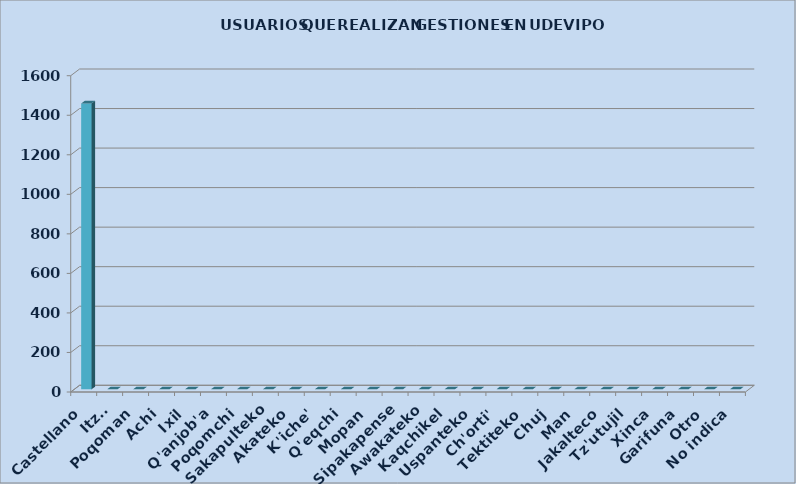
| Category | Series 0 |
|---|---|
| Castellano | 1446 |
| Itza' | 0 |
| Poqoman | 0 |
| Achi | 0 |
| Ixil | 0 |
| Q'anjob'a | 0 |
| Poqomchi | 0 |
| Sakapulteko | 0 |
| Akateko | 0 |
| K'iche' | 0 |
| Q'eqchi | 0 |
| Mopan | 0 |
| Sipakapense | 0 |
| Awakateko | 0 |
| Kaqchikel | 0 |
| Uspanteko | 0 |
| Ch'orti' | 0 |
| Tektiteko | 0 |
| Chuj | 0 |
| Man | 0 |
| Jakalteco | 0 |
| Tz'utujil | 0 |
| Xinca | 0 |
| Garifuna | 0 |
| Otro | 0 |
| No indica | 0 |